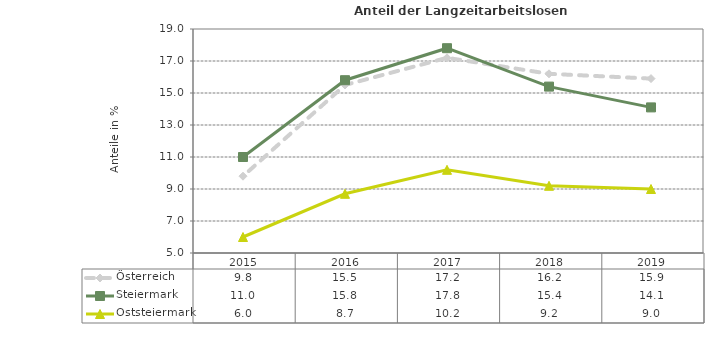
| Category | Österreich | Steiermark | Oststeiermark |
|---|---|---|---|
| 2019.0 | 15.9 | 14.1 | 9 |
| 2018.0 | 16.2 | 15.4 | 9.2 |
| 2017.0 | 17.2 | 17.8 | 10.2 |
| 2016.0 | 15.5 | 15.8 | 8.7 |
| 2015.0 | 9.8 | 11 | 6 |